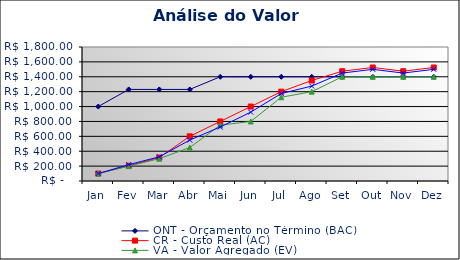
| Category | ONT - Orçamento no Término (BAC) | CR - Custo Real (AC) | VA - Valor Agregado (EV) | VP - Valor Planejado (PV) |
|---|---|---|---|---|
| Jan | 1000 | 100 | 100 | 100 |
| Fev | 1230 | 205 | 200 | 220 |
| Mar | 1230 | 315 | 300 | 325 |
| Abr | 1230 | 600 | 450 | 550 |
| Mai | 1400 | 800 | 750 | 725 |
| Jun | 1400 | 1000 | 800 | 925 |
| Jul | 1400 | 1200 | 1125 | 1175 |
| Ago | 1400 | 1350 | 1200 | 1275 |
| Set | 1400 | 1475 | 1400 | 1450 |
| Out | 1400 | 1525 | 1400 | 1500 |
| Nov | 1400 | 1475 | 1400 | 1450 |
| Dez | 1400 | 1525 | 1400 | 1500 |